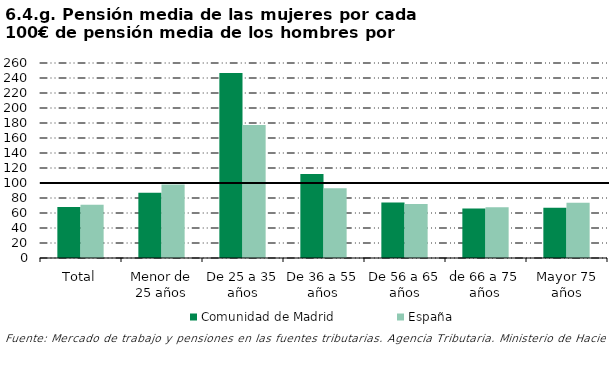
| Category | Comunidad de Madrid | España |
|---|---|---|
| Total | 67.961 | 71.144 |
| Menor de 25 años | 87.155 | 98.027 |
| De 25 a 35 años | 246.793 | 177.201 |
| De 36 a 55 años | 111.858 | 93.127 |
| De 56 a 65 años | 73.92 | 72.134 |
| de 66 a 75 años | 65.891 | 67.601 |
| Mayor 75 años | 66.871 | 73.819 |